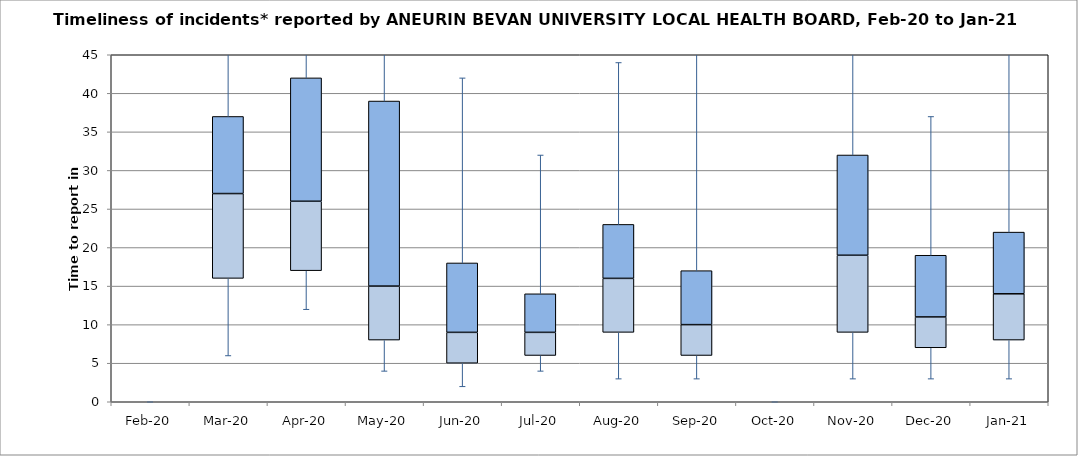
| Category | Series 0 | Series 1 | Series 2 |
|---|---|---|---|
| Feb-20 | 0 | 0 | 0 |
| Mar-20 | 16 | 11 | 10 |
| Apr-20 | 17 | 9 | 16 |
| May-20 | 8 | 7 | 24 |
| Jun-20 | 5 | 4 | 9 |
| Jul-20 | 6 | 3 | 5 |
| Aug-20 | 9 | 7 | 7 |
| Sep-20 | 6 | 4 | 7 |
| Oct-20 | 0 | 0 | 0 |
| Nov-20 | 9 | 10 | 13 |
| Dec-20 | 7 | 4 | 8 |
| Jan-21 | 8 | 6 | 8 |